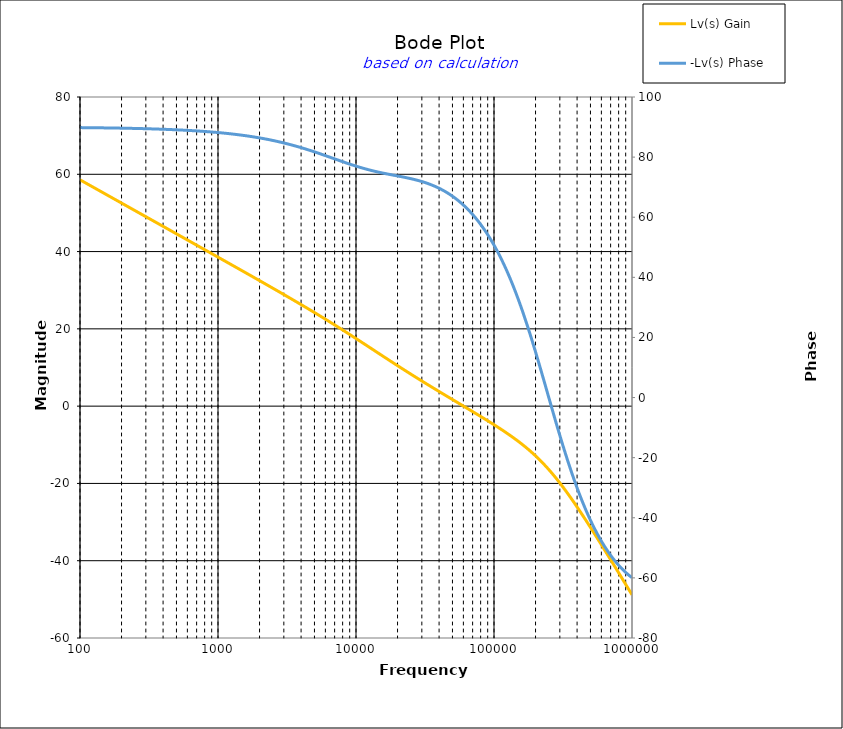
| Category | Lv(s) Gain |
|---|---|
| 100.0 | 58.57 |
| 104.71285480508996 | 58.17 |
| 109.64781961431851 | 57.77 |
| 114.81536214968828 | 57.37 |
| 120.2264434617413 | 56.97 |
| 125.89254117941672 | 56.57 |
| 131.82567385564073 | 56.17 |
| 138.0384264602885 | 55.77 |
| 144.54397707459273 | 55.37 |
| 151.35612484362082 | 54.97 |
| 158.48931924611136 | 54.57 |
| 165.95869074375605 | 54.17 |
| 173.78008287493756 | 53.77 |
| 181.97008586099835 | 53.369 |
| 190.54607179632475 | 52.969 |
| 199.526231496888 | 52.569 |
| 208.92961308540396 | 52.169 |
| 218.77616239495526 | 51.769 |
| 229.08676527677733 | 51.369 |
| 239.8832919019491 | 50.969 |
| 251.18864315095806 | 50.569 |
| 263.0267991895382 | 50.169 |
| 275.4228703338166 | 49.769 |
| 288.4031503126606 | 49.369 |
| 301.9951720402017 | 48.969 |
| 316.22776601683796 | 48.568 |
| 331.13112148259114 | 48.168 |
| 346.7368504525317 | 47.768 |
| 363.0780547701014 | 47.368 |
| 380.1893963205612 | 46.968 |
| 398.10717055349727 | 46.567 |
| 416.8693834703355 | 46.167 |
| 436.515832240166 | 45.767 |
| 457.0881896148751 | 45.367 |
| 478.6300923226384 | 44.966 |
| 501.18723362727235 | 44.566 |
| 524.8074602497726 | 44.165 |
| 549.5408738576245 | 43.765 |
| 575.4399373371572 | 43.364 |
| 602.559586074358 | 42.964 |
| 630.9573444801935 | 42.563 |
| 660.6934480075963 | 42.163 |
| 691.8309709189367 | 41.762 |
| 724.4359600749902 | 41.361 |
| 758.5775750291838 | 40.96 |
| 794.3282347242817 | 40.559 |
| 831.7637711026711 | 40.158 |
| 870.9635899560808 | 39.757 |
| 912.0108393559099 | 39.356 |
| 954.9925860214358 | 38.955 |
| 1000.0 | 38.553 |
| 1047.1285480509 | 38.152 |
| 1096.4781961431854 | 37.75 |
| 1148.1536214968835 | 37.348 |
| 1202.2644346174134 | 36.946 |
| 1258.925411794168 | 36.543 |
| 1318.2567385564075 | 36.141 |
| 1380.3842646028857 | 35.738 |
| 1445.4397707459275 | 35.335 |
| 1513.5612484362086 | 34.932 |
| 1584.8931924611136 | 34.528 |
| 1659.5869074375614 | 34.124 |
| 1737.8008287493756 | 33.72 |
| 1819.7008586099842 | 33.315 |
| 1905.4607179632476 | 32.91 |
| 1995.2623149688804 | 32.504 |
| 2089.29613085404 | 32.098 |
| 2187.7616239495537 | 31.691 |
| 2290.867652767774 | 31.283 |
| 2398.832919019492 | 30.875 |
| 2511.886431509581 | 30.467 |
| 2630.2679918953822 | 30.057 |
| 2754.2287033381667 | 29.647 |
| 2884.0315031266064 | 29.235 |
| 3019.9517204020162 | 28.823 |
| 3162.2776601683804 | 28.409 |
| 3311.311214825913 | 27.995 |
| 3467.368504525318 | 27.579 |
| 3630.7805477010156 | 27.162 |
| 3801.893963205614 | 26.744 |
| 3981.0717055349755 | 26.324 |
| 4168.693834703356 | 25.902 |
| 4365.158322401663 | 25.479 |
| 4570.881896148753 | 25.054 |
| 4786.300923226386 | 24.627 |
| 5011.872336272724 | 24.198 |
| 5248.074602497729 | 23.767 |
| 5495.408738576247 | 23.334 |
| 5754.39937337157 | 22.898 |
| 6025.595860743582 | 22.461 |
| 6309.573444801937 | 22.021 |
| 6606.934480075963 | 21.579 |
| 6918.309709189366 | 21.134 |
| 7244.359600749906 | 20.687 |
| 7585.775750291843 | 20.237 |
| 7943.28234724282 | 19.786 |
| 8317.637711026713 | 19.332 |
| 8709.635899560808 | 18.875 |
| 9120.108393559098 | 18.417 |
| 9549.925860214365 | 17.956 |
| 10000.0 | 17.494 |
| 10471.285480508997 | 17.03 |
| 10964.781961431861 | 16.565 |
| 11481.536214968835 | 16.099 |
| 12022.644346174135 | 15.631 |
| 12589.254117941677 | 15.163 |
| 13182.567385564085 | 14.694 |
| 13803.842646028861 | 14.226 |
| 14454.397707459284 | 13.757 |
| 15135.612484362091 | 13.289 |
| 15848.931924611154 | 12.821 |
| 16595.869074375623 | 12.355 |
| 17378.00828749377 | 11.889 |
| 18197.008586099848 | 11.425 |
| 19054.607179632498 | 10.963 |
| 19952.623149688818 | 10.502 |
| 20892.961308540394 | 10.043 |
| 21877.616239495524 | 9.586 |
| 22908.676527677744 | 9.131 |
| 23988.329190194912 | 8.678 |
| 25118.864315095805 | 8.228 |
| 26302.679918953818 | 7.779 |
| 27542.287033381683 | 7.333 |
| 28840.315031266073 | 6.889 |
| 30199.51720402017 | 6.447 |
| 31622.776601683825 | 6.007 |
| 33113.11214825913 | 5.568 |
| 34673.68504525318 | 5.132 |
| 36307.80547701015 | 4.698 |
| 38018.939632056165 | 4.265 |
| 39810.71705534976 | 3.833 |
| 41686.938347033574 | 3.403 |
| 43651.58322401662 | 2.973 |
| 45708.81896148756 | 2.545 |
| 47863.00923226389 | 2.118 |
| 50118.723362727265 | 1.691 |
| 52480.74602497729 | 1.264 |
| 54954.087385762534 | 0.838 |
| 57543.99373371576 | 0.412 |
| 60255.95860743583 | -0.014 |
| 63095.73444801938 | -0.441 |
| 66069.34480075965 | -0.869 |
| 69183.09709189367 | -1.297 |
| 72443.59600749903 | -1.727 |
| 75857.75750291838 | -2.159 |
| 79432.82347242821 | -2.593 |
| 83176.37711026715 | -3.029 |
| 87096.3589956081 | -3.468 |
| 91201.08393559098 | -3.91 |
| 95499.25860214367 | -4.356 |
| 100000.0 | -4.807 |
| 104712.85480509 | -5.263 |
| 109647.81961431864 | -5.726 |
| 114815.3621496884 | -6.195 |
| 120226.44346174138 | -6.672 |
| 125892.5411794168 | -7.159 |
| 131825.6738556409 | -7.655 |
| 138038.42646028864 | -8.164 |
| 144543.9770745929 | -8.685 |
| 151356.12484362093 | -9.221 |
| 158489.31924611155 | -9.772 |
| 165958.69074375625 | -10.342 |
| 173780.0828749377 | -10.931 |
| 181970.08586099852 | -11.542 |
| 190546.071796325 | -12.175 |
| 199526.2314968882 | -12.833 |
| 208929.6130854042 | -13.517 |
| 218776.1623949553 | -14.228 |
| 229086.7652767775 | -14.968 |
| 239883.29190194918 | -15.736 |
| 251188.64315095812 | -16.534 |
| 263026.79918953823 | -17.362 |
| 275422.8703338169 | -18.218 |
| 288403.1503126608 | -19.103 |
| 301995.1720402018 | -20.016 |
| 316227.766016838 | -20.954 |
| 331131.12148259114 | -21.918 |
| 346736.85045253224 | -22.905 |
| 363078.0547701019 | -23.913 |
| 380189.3963205617 | -24.942 |
| 398107.1705534977 | -25.988 |
| 416869.38347033586 | -27.051 |
| 436515.8322401663 | -28.129 |
| 457088.1896148753 | -29.22 |
| 478630.0923226385 | -30.323 |
| 501187.23362727324 | -31.436 |
| 524807.4602497736 | -32.559 |
| 549540.8738576254 | -33.691 |
| 575439.9373371577 | -34.829 |
| 602559.5860743586 | -35.974 |
| 630957.3444801938 | -37.124 |
| 660693.4480075965 | -38.28 |
| 691830.9709189369 | -39.439 |
| 724435.9600749904 | -40.602 |
| 758577.5750291839 | -41.769 |
| 794328.2347242816 | -42.938 |
| 831763.7711026709 | -44.11 |
| 870963.5899560819 | -45.283 |
| 912010.8393559109 | -46.459 |
| 954992.586021437 | -47.635 |
| 1000000.0 | -48.813 |